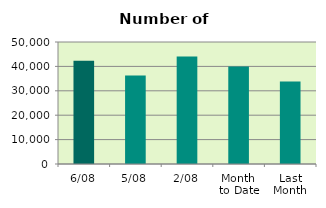
| Category | Series 0 |
|---|---|
| 6/08 | 42270 |
| 5/08 | 36284 |
| 2/08 | 44052 |
| Month 
to Date | 39936 |
| Last
Month | 33803.652 |